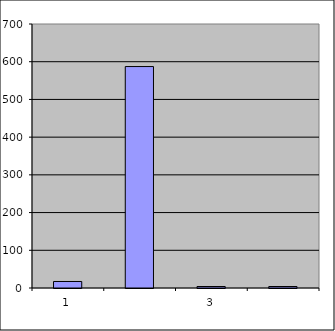
| Category | Series 0 |
|---|---|
| 0 | 17.25 |
| 1 | 587.183 |
| 2 | 3.9 |
| 3 | 3.928 |